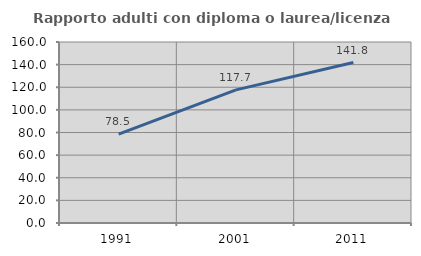
| Category | Rapporto adulti con diploma o laurea/licenza media  |
|---|---|
| 1991.0 | 78.494 |
| 2001.0 | 117.7 |
| 2011.0 | 141.844 |